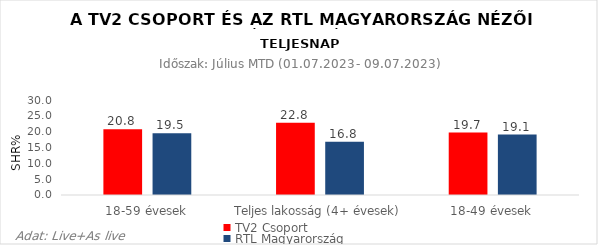
| Category | TV2 Csoport | RTL Magyarország |
|---|---|---|
| 18-59 évesek | 20.8 | 19.5 |
| Teljes lakosság (4+ évesek) | 22.8 | 16.8 |
| 18-49 évesek | 19.7 | 19.1 |